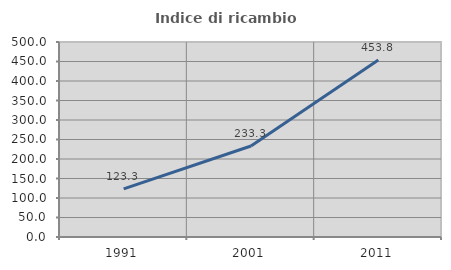
| Category | Indice di ricambio occupazionale  |
|---|---|
| 1991.0 | 123.333 |
| 2001.0 | 233.333 |
| 2011.0 | 453.846 |